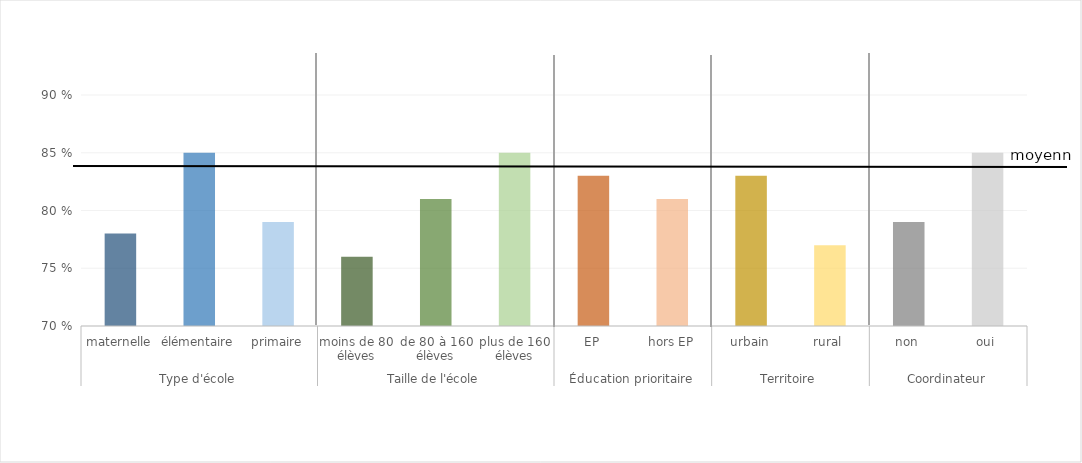
| Category | Series 0 |
|---|---|
| 0 | 0.78 |
| 1 | 0.85 |
| 2 | 0.79 |
| 3 | 0.76 |
| 4 | 0.81 |
| 5 | 0.85 |
| 6 | 0.83 |
| 7 | 0.81 |
| 8 | 0.83 |
| 9 | 0.77 |
| 10 | 0.79 |
| 11 | 0.85 |